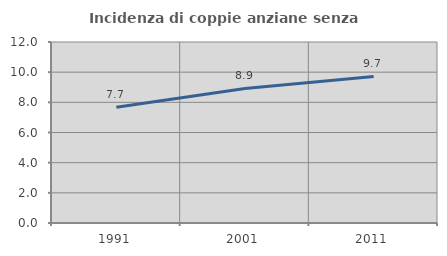
| Category | Incidenza di coppie anziane senza figli  |
|---|---|
| 1991.0 | 7.672 |
| 2001.0 | 8.923 |
| 2011.0 | 9.719 |